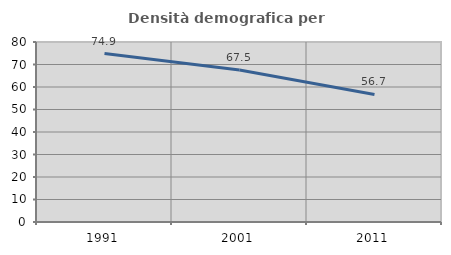
| Category | Densità demografica |
|---|---|
| 1991.0 | 74.875 |
| 2001.0 | 67.516 |
| 2011.0 | 56.668 |